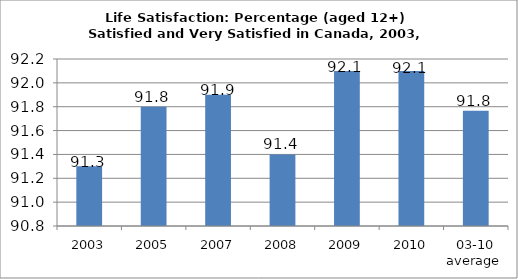
| Category | Canada |
|---|---|
| 2003 | 91.3 |
| 2005 | 91.8 |
| 2007 | 91.9 |
| 2008 | 91.4 |
| 2009 | 92.1 |
| 2010 | 92.1 |
| 03-10 average  | 91.767 |